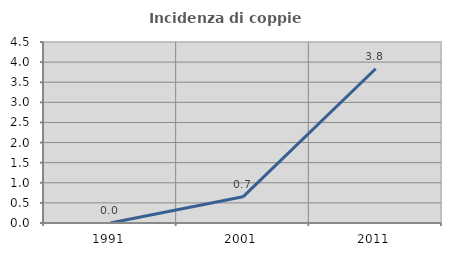
| Category | Incidenza di coppie miste |
|---|---|
| 1991.0 | 0 |
| 2001.0 | 0.651 |
| 2011.0 | 3.835 |